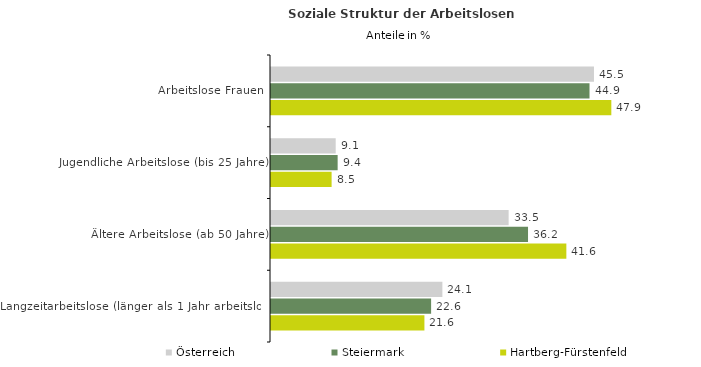
| Category | Österreich | Steiermark | Hartberg-Fürstenfeld |
|---|---|---|---|
| Arbeitslose Frauen | 45.49 | 44.861 | 47.934 |
| Jugendliche Arbeitslose (bis 25 Jahre) | 9.111 | 9.387 | 8.535 |
| Ältere Arbeitslose (ab 50 Jahre) | 33.469 | 36.201 | 41.599 |
| Langzeitarbeitslose (länger als 1 Jahr arbeitslos) | 24.136 | 22.55 | 21.608 |